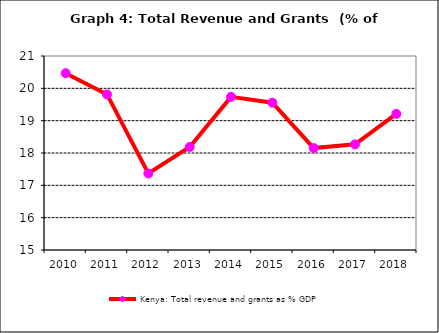
| Category | Kenya: Total revenue and grants as % GDP |
|---|---|
| 2010.0 | 20.468 |
| 2011.0 | 19.812 |
| 2012.0 | 17.366 |
| 2013.0 | 18.186 |
| 2014.0 | 19.736 |
| 2015.0 | 19.556 |
| 2016.0 | 18.152 |
| 2017.0 | 18.267 |
| 2018.0 | 19.21 |